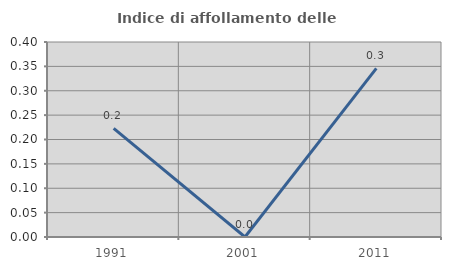
| Category | Indice di affollamento delle abitazioni  |
|---|---|
| 1991.0 | 0.223 |
| 2001.0 | 0 |
| 2011.0 | 0.346 |